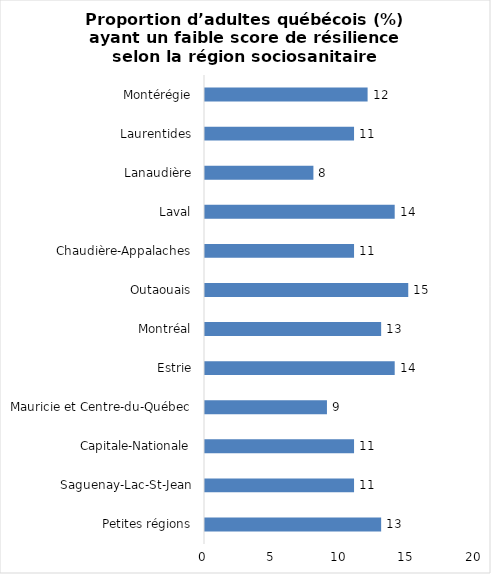
| Category | Series 0 |
|---|---|
| Petites régions | 13 |
| Saguenay-Lac-St-Jean | 11 |
| Capitale-Nationale | 11 |
| Mauricie et Centre-du-Québec | 9 |
| Estrie | 14 |
| Montréal | 13 |
| Outaouais | 15 |
| Chaudière-Appalaches | 11 |
| Laval | 14 |
| Lanaudière | 8 |
| Laurentides | 11 |
| Montérégie | 12 |